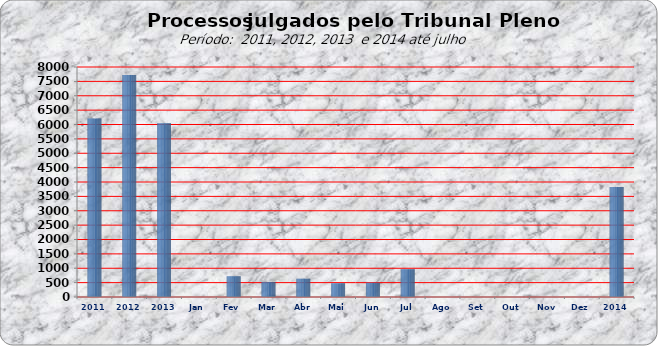
| Category | 6205 7722 6043 0 721 524 638 481 496 969 0 0 0 0 0 |
|---|---|
| 2011 | 6205 |
| 2012 | 7722 |
| 2013 | 6043 |
| Jan | 0 |
| Fev | 721 |
| Mar | 524 |
| Abr | 638 |
| Mai | 481 |
| Jun | 496 |
| Jul | 969 |
| Ago | 0 |
| Set | 0 |
| Out | 0 |
| Nov | 0 |
| Dez | 0 |
| 2014 | 3829 |